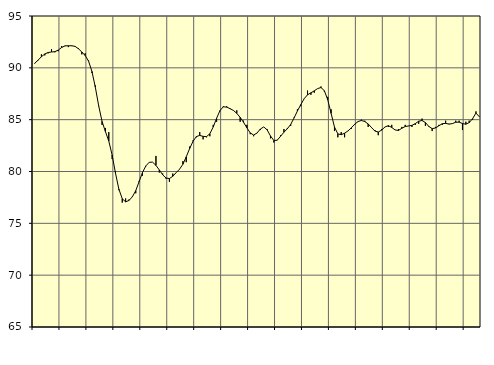
| Category | Piggar | Series 1 |
|---|---|---|
| nan | 90.4 | 90.44 |
| 87.0 | 90.7 | 90.74 |
| 87.0 | 91.3 | 91.07 |
| 87.0 | 91.2 | 91.34 |
| nan | 91.4 | 91.48 |
| 88.0 | 91.8 | 91.53 |
| 88.0 | 91.5 | 91.56 |
| 88.0 | 91.6 | 91.71 |
| nan | 92.1 | 91.96 |
| 89.0 | 92.1 | 92.12 |
| 89.0 | 92 | 92.13 |
| 89.0 | 92.1 | 92.13 |
| nan | 92.1 | 92.07 |
| 90.0 | 91.9 | 91.84 |
| 90.0 | 91.3 | 91.53 |
| 90.0 | 91.4 | 91.18 |
| nan | 90.7 | 90.64 |
| 91.0 | 89.5 | 89.65 |
| 91.0 | 88.3 | 88.14 |
| 91.0 | 86.3 | 86.34 |
| nan | 84.5 | 84.83 |
| 92.0 | 84.2 | 83.85 |
| 92.0 | 83.8 | 82.94 |
| 92.0 | 81.2 | 81.58 |
| nan | 80 | 79.82 |
| 93.0 | 78.2 | 78.29 |
| 93.0 | 77 | 77.37 |
| 93.0 | 77.4 | 77.07 |
| nan | 77.3 | 77.21 |
| 94.0 | 77.6 | 77.56 |
| 94.0 | 77.9 | 78.15 |
| 94.0 | 79.1 | 79.02 |
| nan | 79.6 | 79.9 |
| 95.0 | 80.5 | 80.54 |
| 95.0 | 80.9 | 80.89 |
| 95.0 | 80.9 | 80.9 |
| nan | 81.5 | 80.59 |
| 96.0 | 79.9 | 80.15 |
| 96.0 | 79.8 | 79.68 |
| 96.0 | 79.3 | 79.37 |
| nan | 79 | 79.32 |
| 97.0 | 79.8 | 79.54 |
| 97.0 | 79.9 | 79.89 |
| 97.0 | 80.2 | 80.22 |
| nan | 81 | 80.7 |
| 98.0 | 80.9 | 81.42 |
| 98.0 | 82.4 | 82.21 |
| 98.0 | 83 | 82.91 |
| nan | 83.3 | 83.37 |
| 99.0 | 83.8 | 83.48 |
| 99.0 | 83.1 | 83.39 |
| 99.0 | 83.3 | 83.36 |
| nan | 83.4 | 83.64 |
| 0.0 | 84.5 | 84.29 |
| 0.0 | 84.8 | 85.13 |
| 0.0 | 85.8 | 85.87 |
| nan | 86.3 | 86.24 |
| 1.0 | 86.3 | 86.21 |
| 1.0 | 86.1 | 86.06 |
| 1.0 | 85.9 | 85.89 |
| nan | 85.9 | 85.61 |
| 2.0 | 84.8 | 85.22 |
| 2.0 | 84.9 | 84.75 |
| 2.0 | 84.5 | 84.21 |
| nan | 83.6 | 83.72 |
| 3.0 | 83.4 | 83.52 |
| 3.0 | 83.7 | 83.71 |
| 3.0 | 84 | 84.1 |
| nan | 84.3 | 84.3 |
| 4.0 | 84.1 | 84.02 |
| 4.0 | 83.2 | 83.43 |
| 4.0 | 82.8 | 82.99 |
| nan | 83 | 83.02 |
| 5.0 | 83.5 | 83.4 |
| 5.0 | 84.1 | 83.79 |
| 5.0 | 84.2 | 84.12 |
| nan | 84.4 | 84.54 |
| 6.0 | 85.2 | 85.16 |
| 6.0 | 86 | 85.84 |
| 6.0 | 86.3 | 86.45 |
| nan | 87 | 87.02 |
| 7.0 | 87.8 | 87.4 |
| 7.0 | 87.4 | 87.59 |
| 7.0 | 87.6 | 87.78 |
| nan | 88 | 88 |
| 8.0 | 88.2 | 88.1 |
| 8.0 | 87.7 | 87.79 |
| 8.0 | 87.2 | 86.92 |
| nan | 86 | 85.61 |
| 9.0 | 83.9 | 84.29 |
| 9.0 | 83.3 | 83.63 |
| 9.0 | 83.8 | 83.55 |
| nan | 83.3 | 83.69 |
| 10.0 | 83.9 | 83.91 |
| 10.0 | 84.1 | 84.21 |
| 10.0 | 84.5 | 84.56 |
| nan | 84.8 | 84.82 |
| 11.0 | 85 | 84.92 |
| 11.0 | 84.9 | 84.82 |
| 11.0 | 84.3 | 84.59 |
| nan | 84.2 | 84.24 |
| 12.0 | 84 | 83.9 |
| 12.0 | 83.5 | 83.81 |
| 12.0 | 84.1 | 83.99 |
| nan | 84.3 | 84.3 |
| 13.0 | 84.3 | 84.42 |
| 13.0 | 84.5 | 84.25 |
| 13.0 | 84 | 84.01 |
| nan | 84.1 | 83.96 |
| 14.0 | 84.3 | 84.17 |
| 14.0 | 84.5 | 84.34 |
| 14.0 | 84.4 | 84.39 |
| nan | 84.3 | 84.45 |
| 15.0 | 84.5 | 84.62 |
| 15.0 | 84.6 | 84.85 |
| 15.0 | 85.1 | 84.92 |
| nan | 84.4 | 84.72 |
| 16.0 | 84.3 | 84.35 |
| 16.0 | 83.9 | 84.13 |
| 16.0 | 84.3 | 84.2 |
| nan | 84.5 | 84.41 |
| 17.0 | 84.5 | 84.61 |
| 17.0 | 84.9 | 84.64 |
| 17.0 | 84.6 | 84.57 |
| nan | 84.6 | 84.62 |
| 18.0 | 84.9 | 84.75 |
| 18.0 | 84.9 | 84.76 |
| 18.0 | 84 | 84.63 |
| nan | 84.8 | 84.56 |
| 19.0 | 84.9 | 84.72 |
| 19.0 | 85 | 85.09 |
| 19.0 | 85.8 | 85.64 |
| nan | 85.3 | 85.28 |